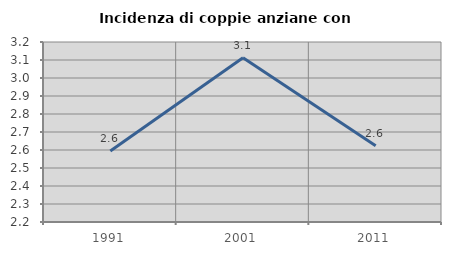
| Category | Incidenza di coppie anziane con figli |
|---|---|
| 1991.0 | 2.594 |
| 2001.0 | 3.112 |
| 2011.0 | 2.623 |